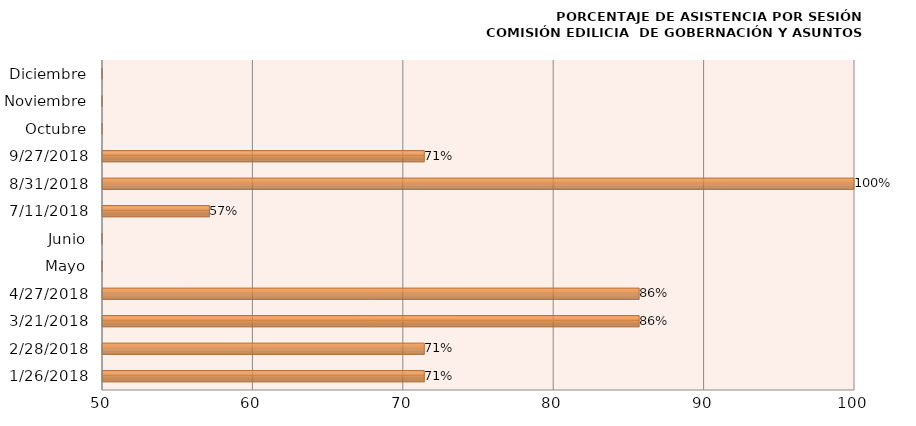
| Category | Series 0 |
|---|---|
| 26/01/2018 | 71.429 |
| 28/02/2018 | 71.429 |
| 21/03/2018 | 85.714 |
| 27/04/2018 | 85.714 |
| Mayo | 0 |
| Junio | 0 |
| 11/07/2018 | 57.143 |
| 31/08/2018 | 100 |
| 27/09/2018 | 71.429 |
| Octubre | 0 |
| Noviembre | 0 |
| Diciembre | 0 |